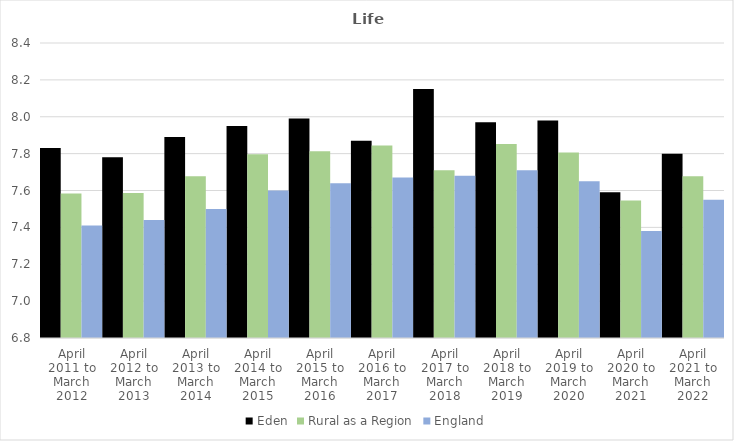
| Category | Eden | Rural as a Region | England |
|---|---|---|---|
| April 2011 to March 2012 | 7.83 | 7.584 | 7.41 |
| April 2012 to March 2013 | 7.78 | 7.586 | 7.44 |
| April 2013 to March 2014 | 7.89 | 7.677 | 7.5 |
| April 2014 to March 2015 | 7.95 | 7.797 | 7.6 |
| April 2015 to March 2016 | 7.99 | 7.813 | 7.64 |
| April 2016 to March 2017 | 7.87 | 7.845 | 7.67 |
| April 2017 to March 2018 | 8.15 | 7.71 | 7.68 |
| April 2018 to March 2019 | 7.97 | 7.852 | 7.71 |
| April 2019 to March 2020 | 7.98 | 7.806 | 7.65 |
| April 2020 to March 2021 | 7.59 | 7.546 | 7.38 |
| April 2021 to March 2022 | 7.8 | 7.677 | 7.55 |